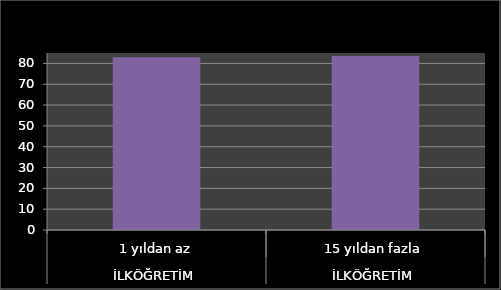
| Category | Series 0 |
|---|---|
| 0 | 83 |
| 1 | 83.5 |